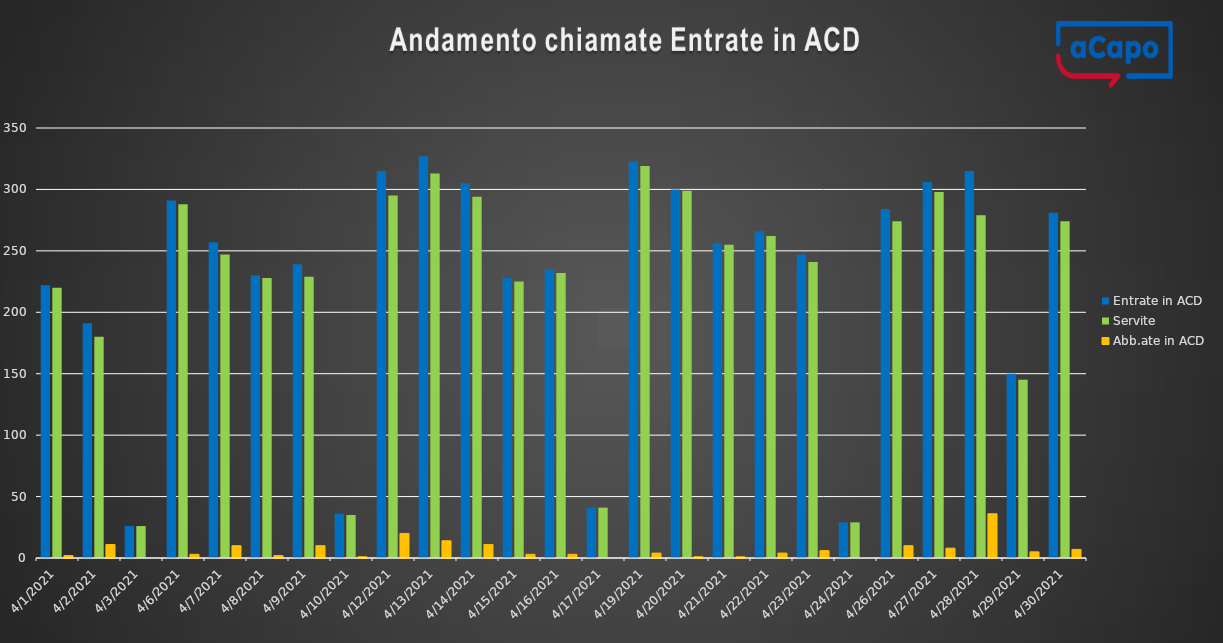
| Category | Entrate in ACD | Servite | Abb.ate in ACD |
|---|---|---|---|
| 4/1/21 | 222 | 220 | 2 |
| 4/2/21 | 191 | 180 | 11 |
| 4/3/21 | 26 | 26 | 0 |
| 4/6/21 | 291 | 288 | 3 |
| 4/7/21 | 257 | 247 | 10 |
| 4/8/21 | 230 | 228 | 2 |
| 4/9/21 | 239 | 229 | 10 |
| 4/10/21 | 36 | 35 | 1 |
| 4/12/21 | 315 | 295 | 20 |
| 4/13/21 | 327 | 313 | 14 |
| 4/14/21 | 305 | 294 | 11 |
| 4/15/21 | 228 | 225 | 3 |
| 4/16/21 | 235 | 232 | 3 |
| 4/17/21 | 41 | 41 | 0 |
| 4/19/21 | 323 | 319 | 4 |
| 4/20/21 | 300 | 299 | 1 |
| 4/21/21 | 256 | 255 | 1 |
| 4/22/21 | 266 | 262 | 4 |
| 4/23/21 | 247 | 241 | 6 |
| 4/24/21 | 29 | 29 | 0 |
| 4/26/21 | 284 | 274 | 10 |
| 4/27/21 | 306 | 298 | 8 |
| 4/28/21 | 315 | 279 | 36 |
| 4/29/21 | 150 | 145 | 5 |
| 4/30/21 | 281 | 274 | 7 |